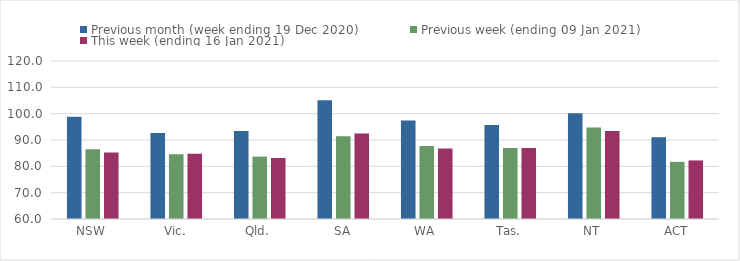
| Category | Previous month (week ending 19 Dec 2020) | Previous week (ending 09 Jan 2021) | This week (ending 16 Jan 2021) |
|---|---|---|---|
| NSW | 98.85 | 86.5 | 85.27 |
| Vic. | 92.7 | 84.59 | 84.74 |
| Qld. | 93.45 | 83.69 | 83.17 |
| SA | 105.13 | 91.39 | 92.49 |
| WA | 97.42 | 87.71 | 86.75 |
| Tas. | 95.69 | 86.98 | 86.98 |
| NT | 100.2 | 94.79 | 93.39 |
| ACT | 91.04 | 81.71 | 82.24 |